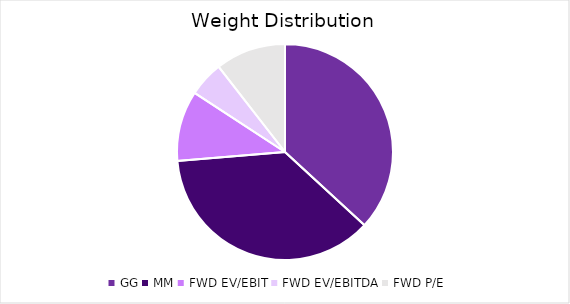
| Category | Weight |
|---|---|
| GG | 0.35 |
| MM | 0.35 |
| FWD EV/EBIT | 0.1 |
| FWD EV/EBITDA | 0.05 |
| FWD P/E | 0.1 |